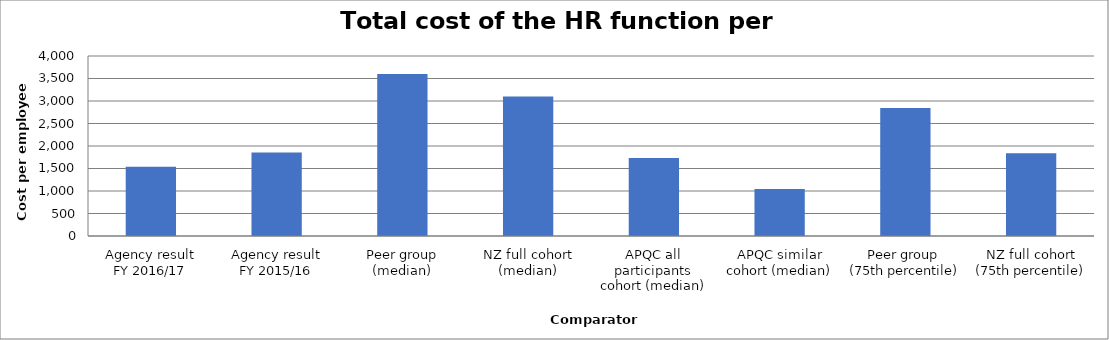
| Category | Result |
|---|---|
| Agency result
FY 2016/17 | 1540.865 |
| Agency result
FY 2015/16 | 1855.015 |
| Peer group (median) | 3598.907 |
| NZ full cohort (median) | 3100.761 |
| APQC all participants cohort (median) | 1734.58 |
| APQC similar cohort (median) | 1045 |
| Peer group 
(75th percentile) | 2845.001 |
| NZ full cohort (75th percentile) | 1840.663 |